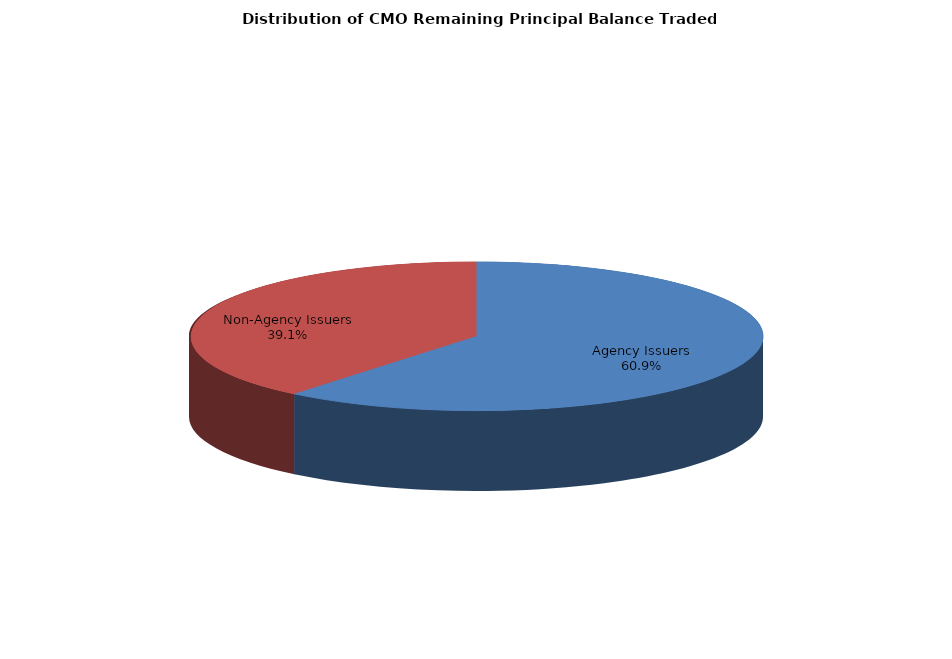
| Category | Series 0 |
|---|---|
| Agency Issuers | 3955802536.047 |
| Non-Agency Issuers | 2539576828.588 |